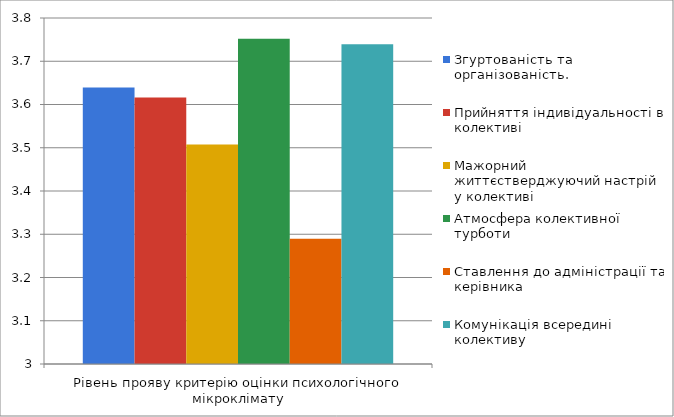
| Category | Згуртованість та організованість. | Прийняття індивідуальності в колективі | Мажорний життєстверджуючий настрій у колективі | Атмосфера колективної турботи | Ставлення до адміністрації та керівника | Комунікація всередині колективу |
|---|---|---|---|---|---|---|
| 0 | 3.639 | 3.616 | 3.507 | 3.752 | 3.29 | 3.739 |